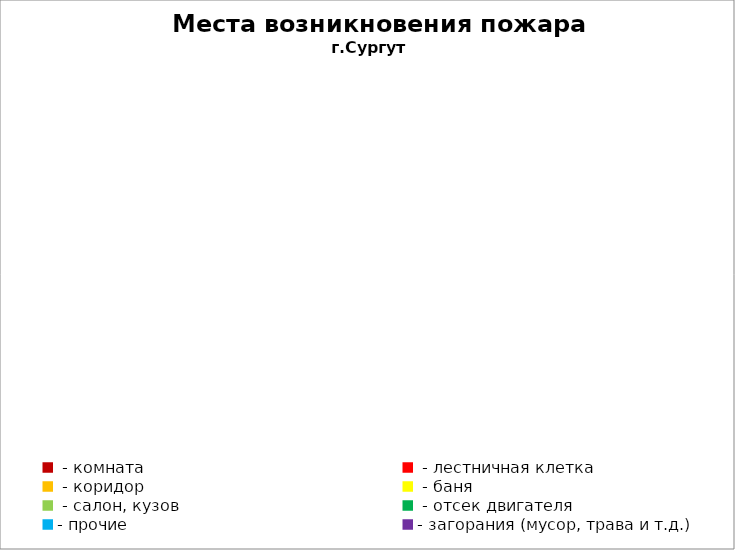
| Category | Места возникновения пожара |
|---|---|
|  - комната | 44 |
|  - лестничная клетка | 10 |
|  - коридор | 7 |
|  - баня | 45 |
|  - салон, кузов | 23 |
|  - отсек двигателя | 34 |
| - прочие | 108 |
| - загорания (мусор, трава и т.д.)  | 105 |